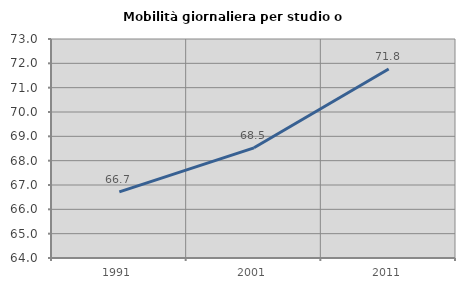
| Category | Mobilità giornaliera per studio o lavoro |
|---|---|
| 1991.0 | 66.716 |
| 2001.0 | 68.528 |
| 2011.0 | 71.767 |